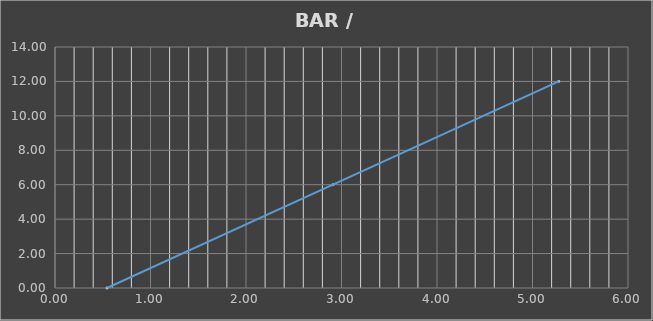
| Category | BAR |
|---|---|
| 5.274705882352944 | 12 |
| 2.910000000000001 | 6 |
| 0.5452941176470587 | 0 |